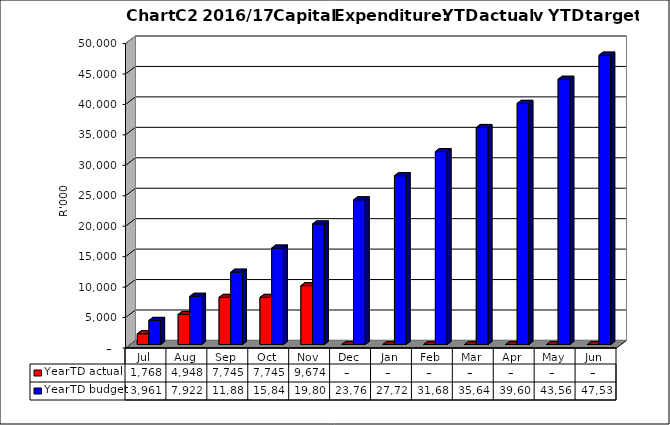
| Category | YearTD actual | YearTD budget |
|---|---|---|
| Jul | 1768200 | 3960831.417 |
| Aug | 4948448 | 7921662.833 |
| Sep | 7745066 | 11882494.25 |
| Oct | 7745067 | 15843325.667 |
| Nov | 9673776 | 19804157.083 |
| Dec | 0 | 23764988.5 |
| Jan | 0 | 27725819.917 |
| Feb | 0 | 31686651.333 |
| Mar | 0 | 35647482.75 |
| Apr | 0 | 39608314.167 |
| May | 0 | 43569145.583 |
| Jun | 0 | 47529977 |